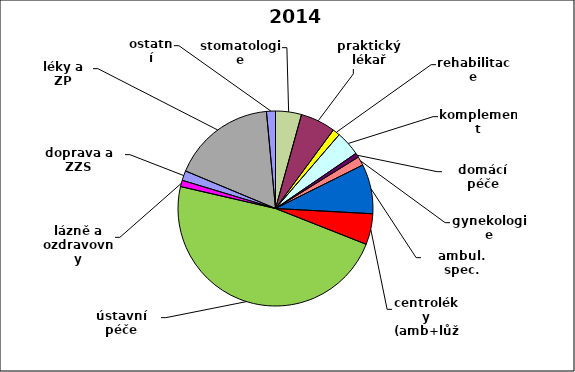
| Category | Series 0 |
|---|---|
| stomatologie | 0.043 |
| praktický lékař | 0.058 |
| rehabilitace | 0.012 |
| komplement | 0.041 |
| domácí péče | 0.007 |
| gynekologie | 0.015 |
| ambul. spec. | 0.082 |
| centroléky (amb+lůž) | 0.051 |
| ústavní péče | 0.476 |
| lázně a ozdravovny | 0.011 |
| doprava a ZZS | 0.016 |
| léky a ZP | 0.172 |
| ostatní | 0.015 |